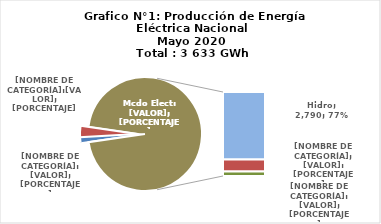
| Category | Series 0 |
|---|---|
| 0 | 49.97 |
| 1 | 117.155 |
| 2 | 2789.676 |
| 3 | 486.82 |
| 4 | 189.534 |